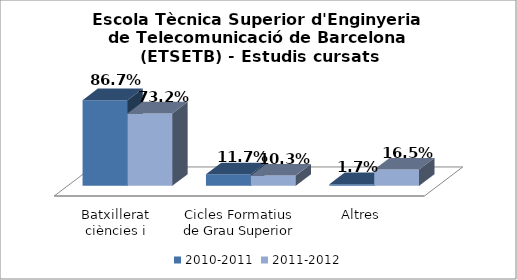
| Category | 2010-2011 | 2011-2012 |
|---|---|---|
| Batxillerat ciències i tecnologia | 0.867 | 0.732 |
| Cicles Formatius de Grau Superior | 0.117 | 0.103 |
| Altres | 0.017 | 0.165 |